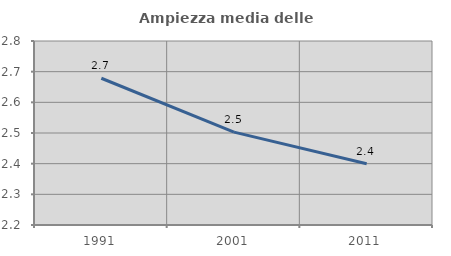
| Category | Ampiezza media delle famiglie |
|---|---|
| 1991.0 | 2.679 |
| 2001.0 | 2.503 |
| 2011.0 | 2.4 |